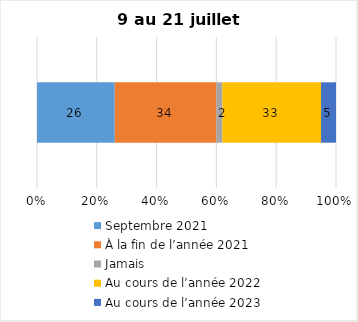
| Category | Septembre 2021 | À la fin de l’année 2021 | Jamais | Au cours de l’année 2022 | Au cours de l’année 2023 |
|---|---|---|---|---|---|
| 0 | 26 | 34 | 2 | 33 | 5 |